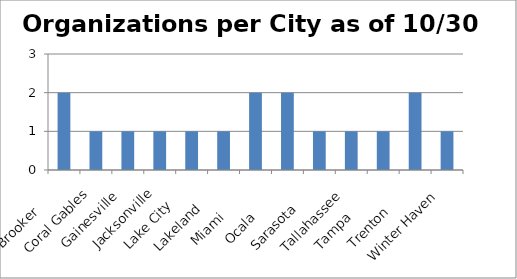
| Category | Organizations per City as of 10/30 |
|---|---|
|  Brooker        | 2 |
|  Coral Gables   | 1 |
|  Gainesville    | 1 |
|  Jacksonville   | 1 |
|  Lake City      | 1 |
|  Lakeland       | 1 |
|  Miami          | 2 |
|  Ocala          | 2 |
|  Sarasota       | 1 |
|  Tallahassee    | 1 |
|  Tampa          | 1 |
|  Trenton        | 2 |
|  Winter Haven   | 1 |